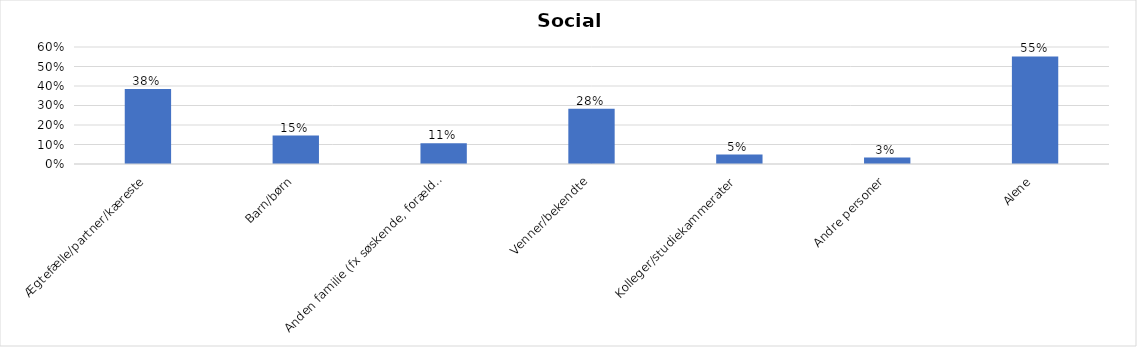
| Category | % |
|---|---|
| Ægtefælle/partner/kæreste | 0.384 |
| Barn/børn | 0.146 |
| Anden familie (fx søskende, forældre) | 0.106 |
| Venner/bekendte | 0.283 |
| Kolleger/studiekammerater | 0.048 |
| Andre personer | 0.033 |
| Alene | 0.552 |